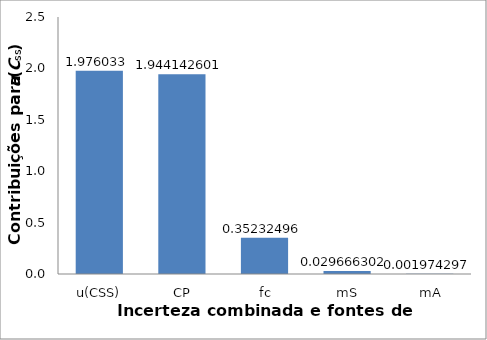
| Category | Series 0 |
|---|---|
|  u(CSS) | 1.976 |
|  CP | 1.944 |
|  fc | 0.352 |
|  mS | 0.03 |
|  mA | 0.002 |